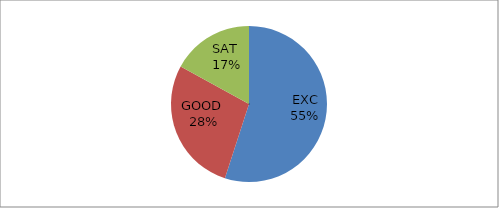
| Category | Series 0 |
|---|---|
| EXC | 55 |
| GOOD  | 28 |
| SAT  | 17 |